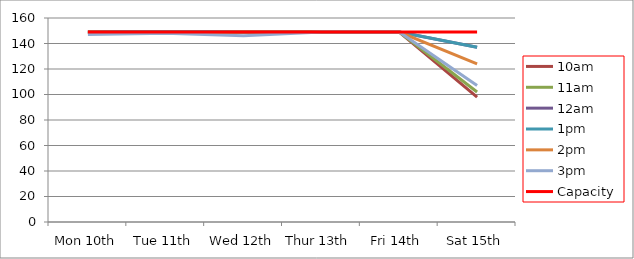
| Category | 9am | 10am | 11am | 12am | 1pm | 2pm | 3pm | 4pm | 5pm | Capacity |
|---|---|---|---|---|---|---|---|---|---|---|
| Mon 10th |  | 149 | 149 | 149 | 149 | 149 | 147 |  |  | 149 |
| Tue 11th |  | 149 | 149 | 149 | 149 | 148 | 148 |  |  | 149 |
| Wed 12th |  | 149 | 149 | 149 | 149 | 149 | 146 |  |  | 149 |
| Thur 13th |  | 149 | 149 | 149 | 149 | 149 | 149 |  |  | 149 |
| Fri 14th |  | 149 | 149 | 149 | 149 | 149 | 149 |  |  | 149 |
| Sat 15th |  | 98 | 102 | 137 | 137 | 124 | 107 |  |  | 149 |